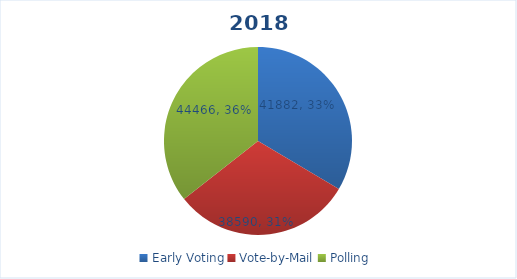
| Category | Series 0 |
|---|---|
| Early Voting | 41882 |
| Vote-by-Mail | 38590 |
| Polling | 44466 |